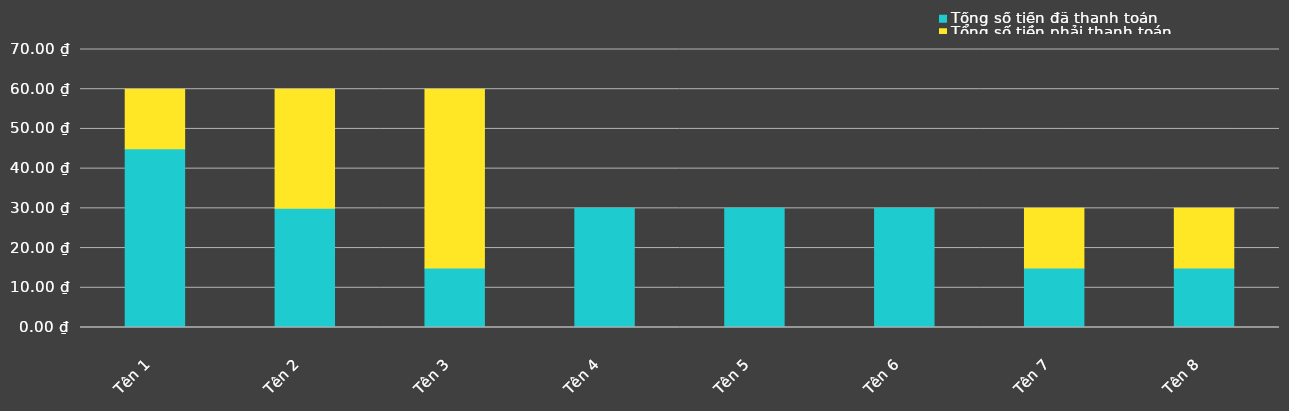
| Category | Tổng số tiền đã thanh toán | Tổng số tiền phải thanh toán |
|---|---|---|
| Tên 1 | 45 | 15 |
| Tên 2 | 30 | 30 |
| Tên 3 | 15 | 45 |
| Tên 4 | 30 | 0 |
| Tên 5 | 30 | 0 |
| Tên 6 | 30 | 0 |
| Tên 7 | 15 | 15 |
| Tên 8 | 15 | 15 |